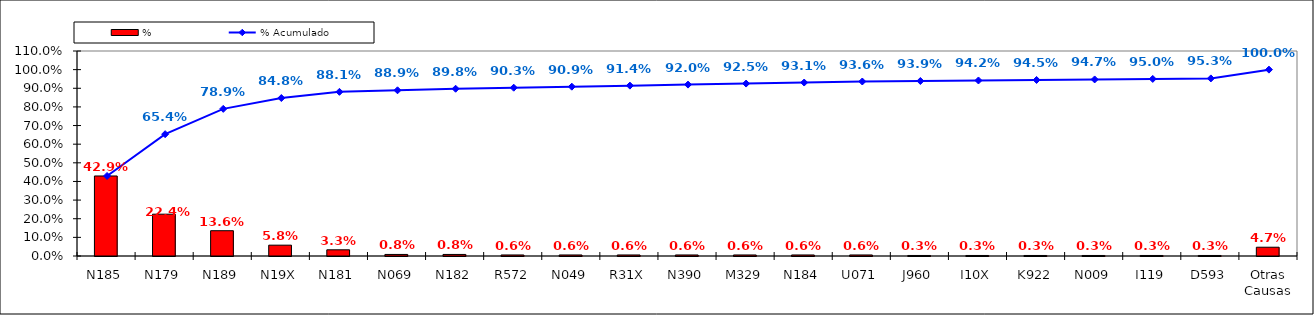
| Category | % |
|---|---|
| N185 | 0.429 |
| N179 | 0.224 |
| N189 | 0.136 |
| N19X | 0.058 |
| N181 | 0.033 |
| N069 | 0.008 |
| N182 | 0.008 |
| R572 | 0.006 |
| N049 | 0.006 |
| R31X | 0.006 |
| N390 | 0.006 |
| M329 | 0.006 |
| N184 | 0.006 |
| U071 | 0.006 |
| J960 | 0.003 |
| I10X | 0.003 |
| K922 | 0.003 |
| N009 | 0.003 |
| I119 | 0.003 |
| D593 | 0.003 |
| Otras Causas | 0.047 |